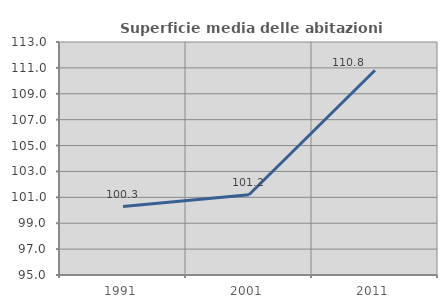
| Category | Superficie media delle abitazioni occupate |
|---|---|
| 1991.0 | 100.287 |
| 2001.0 | 101.199 |
| 2011.0 | 110.814 |